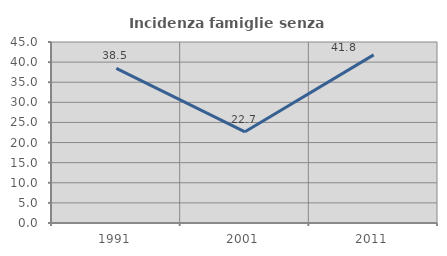
| Category | Incidenza famiglie senza nuclei |
|---|---|
| 1991.0 | 38.462 |
| 2001.0 | 22.677 |
| 2011.0 | 41.791 |